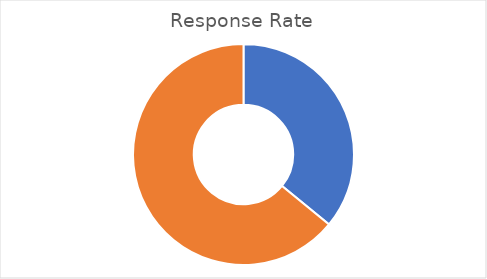
| Category | Total |
|---|---|
| Sum of OverallResRate | 35.911 |
| Sum of OverallNonResRate | 64.089 |